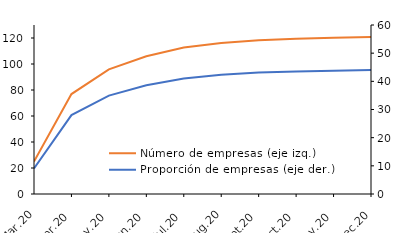
| Category | Número de empresas (eje izq.) |
|---|---|
| 2020-03-01 | 24.912 |
| 2020-04-01 | 76.868 |
| 2020-05-01 | 95.841 |
| 2020-06-01 | 106.012 |
| 2020-07-01 | 112.617 |
| 2020-08-01 | 116.218 |
| 2020-09-01 | 118.326 |
| 2020-10-01 | 119.355 |
| 2020-11-01 | 120.179 |
| 2020-12-01 | 120.784 |